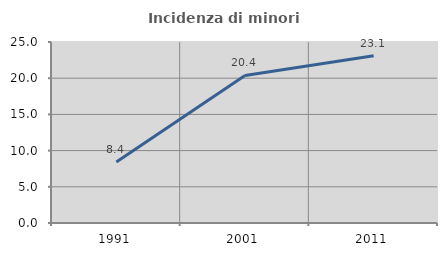
| Category | Incidenza di minori stranieri |
|---|---|
| 1991.0 | 8.421 |
| 2001.0 | 20.382 |
| 2011.0 | 23.114 |